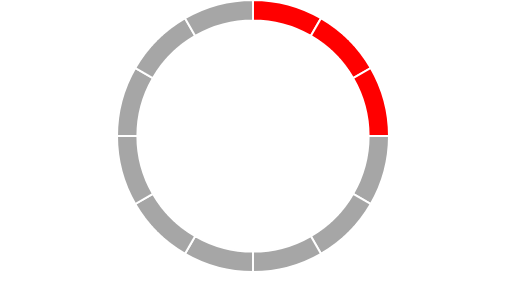
| Category | Series 0 |
|---|---|
| 0 | 5 |
| 1 | 5 |
| 2 | 5 |
| 3 | 5 |
| 4 | 5 |
| 5 | 5 |
| 6 | 5 |
| 7 | 5 |
| 8 | 5 |
| 9 | 5 |
| 10 | 5 |
| 11 | 5 |